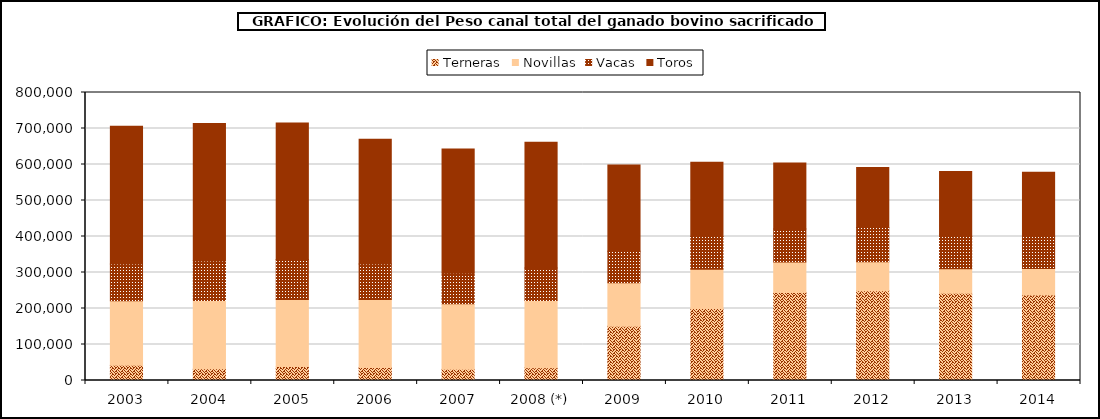
| Category | Terneras | Novillas | Vacas | Toros |
|---|---|---|---|---|
| 2003 | 42608 | 178849.967 | 102375.937 | 382535.472 |
| 2004 | 32509.696 | 189629.471 | 110072.96 | 381674.199 |
| 2005 | 38749.36 | 186497.831 | 110798.423 | 379285.221 |
| 2006 | 36032.274 | 189084.616 | 98804.791 | 346485.954 |
| 2007 | 31445.341 | 181838.873 | 84917.657 | 344965.587 |
| 2008 (*) | 35627.401 | 186852.322 | 89884.28 | 349367.497 |
| 2009 | 150694.983 | 121013.078 | 87398.819 | 239318.172 |
| 2010 | 199955.359 | 109158.53 | 90751.469 | 206730.181 |
| 2011 | 244730.574 | 84120.636 | 91909.223 | 183351.72 |
| 2012 | 249278.477 | 80252.629 | 95185.691 | 166603.472 |
| 2013 | 242186.585 | 68048.006 | 90078.606 | 180527.091 |
| 2014 | 237629.148 | 73287.378 | 90109.546 | 177574.131 |